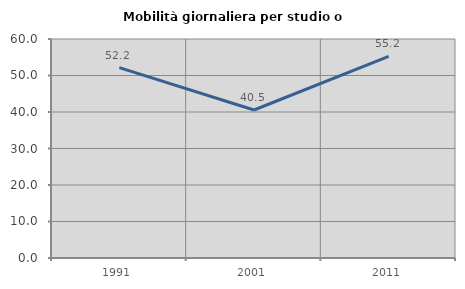
| Category | Mobilità giornaliera per studio o lavoro |
|---|---|
| 1991.0 | 52.151 |
| 2001.0 | 40.545 |
| 2011.0 | 55.236 |